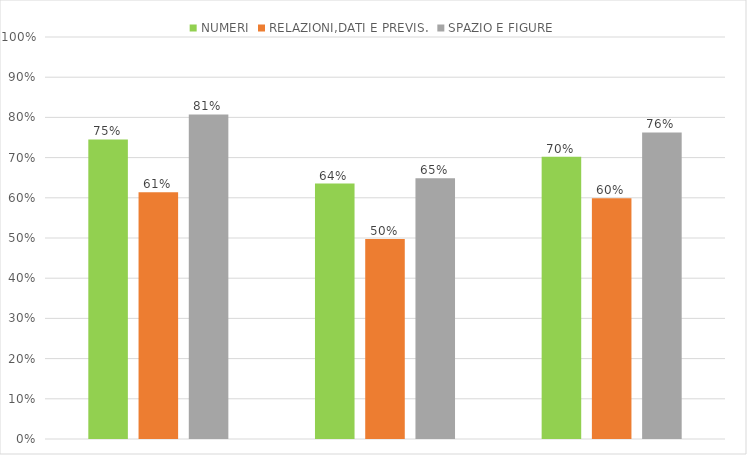
| Category | NUMERI | RELAZIONI,DATI E PREVIS. | SPAZIO E FIGURE |
|---|---|---|---|
| 2A Vivaldi | 0.745 | 0.614 | 0.807 |
| 2B Vivaldi | 0.636 | 0.498 | 0.648 |
| 2C Vivaldi | 0.702 | 0.599 | 0.762 |